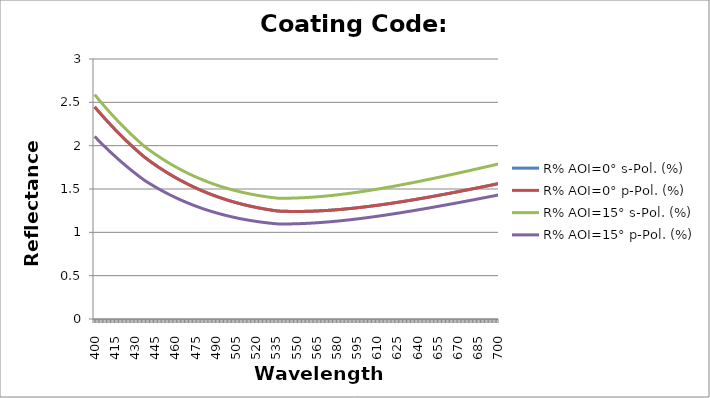
| Category | R% AOI=0° s-Pol. (%) | R% AOI=0° p-Pol. (%) | R% AOI=15° s-Pol. (%) | R% AOI=15° p-Pol. (%) |
|---|---|---|---|---|
| 400.0 | 2.447 | 2.447 | 2.589 | 2.106 |
| 401.0 | 2.429 | 2.429 | 2.57 | 2.09 |
| 402.0 | 2.411 | 2.411 | 2.551 | 2.074 |
| 403.0 | 2.393 | 2.393 | 2.532 | 2.058 |
| 404.0 | 2.375 | 2.375 | 2.514 | 2.043 |
| 405.0 | 2.358 | 2.358 | 2.496 | 2.027 |
| 406.0 | 2.34 | 2.34 | 2.478 | 2.012 |
| 407.0 | 2.323 | 2.323 | 2.46 | 1.996 |
| 408.0 | 2.306 | 2.306 | 2.442 | 1.981 |
| 409.0 | 2.289 | 2.289 | 2.424 | 1.966 |
| 410.0 | 2.272 | 2.272 | 2.407 | 1.952 |
| 411.0 | 2.255 | 2.255 | 2.389 | 1.937 |
| 412.0 | 2.238 | 2.238 | 2.372 | 1.922 |
| 413.0 | 2.222 | 2.222 | 2.355 | 1.908 |
| 414.0 | 2.206 | 2.206 | 2.338 | 1.893 |
| 415.0 | 2.189 | 2.189 | 2.321 | 1.879 |
| 416.0 | 2.173 | 2.173 | 2.305 | 1.865 |
| 417.0 | 2.157 | 2.157 | 2.288 | 1.851 |
| 418.0 | 2.142 | 2.142 | 2.272 | 1.838 |
| 419.0 | 2.126 | 2.126 | 2.256 | 1.824 |
| 420.0 | 2.11 | 2.11 | 2.24 | 1.81 |
| 421.0 | 2.095 | 2.095 | 2.224 | 1.797 |
| 422.0 | 2.08 | 2.08 | 2.208 | 1.784 |
| 423.0 | 2.065 | 2.065 | 2.193 | 1.77 |
| 424.0 | 2.05 | 2.05 | 2.178 | 1.758 |
| 425.0 | 2.035 | 2.035 | 2.162 | 1.745 |
| 426.0 | 2.02 | 2.02 | 2.147 | 1.732 |
| 427.0 | 2.006 | 2.006 | 2.132 | 1.719 |
| 428.0 | 1.991 | 1.991 | 2.118 | 1.707 |
| 429.0 | 1.977 | 1.977 | 2.103 | 1.695 |
| 430.0 | 1.963 | 1.963 | 2.089 | 1.682 |
| 431.0 | 1.949 | 1.949 | 2.074 | 1.67 |
| 432.0 | 1.935 | 1.935 | 2.06 | 1.658 |
| 433.0 | 1.921 | 1.921 | 2.046 | 1.646 |
| 434.0 | 1.908 | 1.908 | 2.033 | 1.635 |
| 435.0 | 1.894 | 1.894 | 2.019 | 1.623 |
| 436.0 | 1.881 | 1.881 | 2.005 | 1.612 |
| 437.0 | 1.868 | 1.868 | 1.992 | 1.6 |
| 438.0 | 1.856 | 1.856 | 1.98 | 1.59 |
| 439.0 | 1.845 | 1.845 | 1.968 | 1.581 |
| 440.0 | 1.833 | 1.833 | 1.957 | 1.571 |
| 441.0 | 1.822 | 1.822 | 1.946 | 1.561 |
| 442.0 | 1.811 | 1.811 | 1.934 | 1.552 |
| 443.0 | 1.8 | 1.8 | 1.924 | 1.543 |
| 444.0 | 1.789 | 1.789 | 1.913 | 1.533 |
| 445.0 | 1.778 | 1.778 | 1.902 | 1.524 |
| 446.0 | 1.768 | 1.768 | 1.891 | 1.515 |
| 447.0 | 1.757 | 1.757 | 1.881 | 1.506 |
| 448.0 | 1.747 | 1.747 | 1.87 | 1.498 |
| 449.0 | 1.736 | 1.736 | 1.86 | 1.489 |
| 450.0 | 1.726 | 1.726 | 1.85 | 1.481 |
| 451.0 | 1.716 | 1.716 | 1.84 | 1.472 |
| 452.0 | 1.707 | 1.707 | 1.83 | 1.464 |
| 453.0 | 1.697 | 1.697 | 1.821 | 1.456 |
| 454.0 | 1.687 | 1.687 | 1.811 | 1.448 |
| 455.0 | 1.678 | 1.678 | 1.802 | 1.44 |
| 456.0 | 1.668 | 1.668 | 1.793 | 1.432 |
| 457.0 | 1.659 | 1.659 | 1.784 | 1.424 |
| 458.0 | 1.65 | 1.65 | 1.774 | 1.417 |
| 459.0 | 1.641 | 1.641 | 1.766 | 1.409 |
| 460.0 | 1.632 | 1.632 | 1.757 | 1.402 |
| 461.0 | 1.623 | 1.623 | 1.748 | 1.394 |
| 462.0 | 1.615 | 1.615 | 1.74 | 1.387 |
| 463.0 | 1.606 | 1.606 | 1.731 | 1.38 |
| 464.0 | 1.598 | 1.598 | 1.723 | 1.373 |
| 465.0 | 1.59 | 1.59 | 1.715 | 1.366 |
| 466.0 | 1.581 | 1.581 | 1.707 | 1.36 |
| 467.0 | 1.573 | 1.573 | 1.699 | 1.353 |
| 468.0 | 1.565 | 1.565 | 1.691 | 1.346 |
| 469.0 | 1.558 | 1.558 | 1.684 | 1.34 |
| 470.0 | 1.55 | 1.55 | 1.676 | 1.334 |
| 471.0 | 1.542 | 1.542 | 1.669 | 1.328 |
| 472.0 | 1.535 | 1.535 | 1.662 | 1.321 |
| 473.0 | 1.527 | 1.527 | 1.654 | 1.315 |
| 474.0 | 1.52 | 1.52 | 1.647 | 1.309 |
| 475.0 | 1.513 | 1.513 | 1.64 | 1.304 |
| 476.0 | 1.506 | 1.506 | 1.633 | 1.298 |
| 477.0 | 1.499 | 1.499 | 1.627 | 1.292 |
| 478.0 | 1.492 | 1.492 | 1.62 | 1.286 |
| 479.0 | 1.485 | 1.485 | 1.614 | 1.281 |
| 480.0 | 1.479 | 1.479 | 1.607 | 1.276 |
| 481.0 | 1.472 | 1.472 | 1.601 | 1.27 |
| 482.0 | 1.466 | 1.466 | 1.595 | 1.265 |
| 483.0 | 1.459 | 1.459 | 1.589 | 1.26 |
| 484.0 | 1.453 | 1.453 | 1.583 | 1.255 |
| 485.0 | 1.447 | 1.447 | 1.577 | 1.25 |
| 486.0 | 1.441 | 1.441 | 1.571 | 1.245 |
| 487.0 | 1.435 | 1.435 | 1.565 | 1.24 |
| 488.0 | 1.429 | 1.429 | 1.56 | 1.236 |
| 489.0 | 1.423 | 1.423 | 1.554 | 1.231 |
| 490.0 | 1.418 | 1.418 | 1.549 | 1.226 |
| 491.0 | 1.412 | 1.412 | 1.544 | 1.222 |
| 492.0 | 1.406 | 1.406 | 1.538 | 1.218 |
| 493.0 | 1.401 | 1.401 | 1.533 | 1.213 |
| 494.0 | 1.396 | 1.396 | 1.528 | 1.209 |
| 495.0 | 1.39 | 1.39 | 1.523 | 1.205 |
| 496.0 | 1.385 | 1.385 | 1.519 | 1.201 |
| 497.0 | 1.38 | 1.38 | 1.514 | 1.197 |
| 498.0 | 1.376 | 1.376 | 1.509 | 1.193 |
| 499.0 | 1.371 | 1.371 | 1.505 | 1.189 |
| 500.0 | 1.366 | 1.366 | 1.5 | 1.186 |
| 501.0 | 1.361 | 1.361 | 1.496 | 1.182 |
| 502.0 | 1.357 | 1.357 | 1.492 | 1.178 |
| 503.0 | 1.352 | 1.352 | 1.488 | 1.175 |
| 504.0 | 1.348 | 1.348 | 1.484 | 1.172 |
| 505.0 | 1.343 | 1.343 | 1.48 | 1.168 |
| 506.0 | 1.339 | 1.339 | 1.476 | 1.165 |
| 507.0 | 1.335 | 1.335 | 1.472 | 1.162 |
| 508.0 | 1.331 | 1.331 | 1.468 | 1.159 |
| 509.0 | 1.327 | 1.327 | 1.464 | 1.156 |
| 510.0 | 1.323 | 1.323 | 1.461 | 1.152 |
| 511.0 | 1.319 | 1.319 | 1.457 | 1.15 |
| 512.0 | 1.315 | 1.315 | 1.454 | 1.147 |
| 513.0 | 1.312 | 1.312 | 1.45 | 1.144 |
| 514.0 | 1.308 | 1.308 | 1.447 | 1.141 |
| 515.0 | 1.304 | 1.304 | 1.444 | 1.139 |
| 516.0 | 1.301 | 1.301 | 1.441 | 1.136 |
| 517.0 | 1.297 | 1.297 | 1.438 | 1.134 |
| 518.0 | 1.294 | 1.294 | 1.435 | 1.131 |
| 519.0 | 1.291 | 1.291 | 1.432 | 1.129 |
| 520.0 | 1.288 | 1.288 | 1.429 | 1.126 |
| 521.0 | 1.285 | 1.285 | 1.427 | 1.124 |
| 522.0 | 1.282 | 1.282 | 1.424 | 1.122 |
| 523.0 | 1.279 | 1.279 | 1.422 | 1.12 |
| 524.0 | 1.276 | 1.276 | 1.419 | 1.118 |
| 525.0 | 1.273 | 1.273 | 1.416 | 1.116 |
| 526.0 | 1.27 | 1.27 | 1.414 | 1.114 |
| 527.0 | 1.267 | 1.267 | 1.412 | 1.112 |
| 528.0 | 1.265 | 1.265 | 1.41 | 1.11 |
| 529.0 | 1.262 | 1.262 | 1.408 | 1.108 |
| 530.0 | 1.26 | 1.26 | 1.405 | 1.106 |
| 531.0 | 1.257 | 1.257 | 1.403 | 1.105 |
| 532.0 | 1.255 | 1.255 | 1.401 | 1.103 |
| 533.0 | 1.253 | 1.253 | 1.4 | 1.102 |
| 534.0 | 1.25 | 1.25 | 1.398 | 1.1 |
| 535.0 | 1.248 | 1.248 | 1.396 | 1.098 |
| 536.0 | 1.246 | 1.246 | 1.394 | 1.097 |
| 537.0 | 1.245 | 1.245 | 1.394 | 1.097 |
| 538.0 | 1.244 | 1.244 | 1.394 | 1.097 |
| 539.0 | 1.244 | 1.244 | 1.394 | 1.096 |
| 540.0 | 1.243 | 1.243 | 1.394 | 1.096 |
| 541.0 | 1.243 | 1.243 | 1.394 | 1.097 |
| 542.0 | 1.242 | 1.242 | 1.394 | 1.097 |
| 543.0 | 1.242 | 1.242 | 1.394 | 1.097 |
| 544.0 | 1.242 | 1.242 | 1.394 | 1.097 |
| 545.0 | 1.242 | 1.242 | 1.394 | 1.097 |
| 546.0 | 1.241 | 1.241 | 1.395 | 1.097 |
| 547.0 | 1.241 | 1.241 | 1.395 | 1.098 |
| 548.0 | 1.241 | 1.241 | 1.395 | 1.098 |
| 549.0 | 1.241 | 1.241 | 1.396 | 1.098 |
| 550.0 | 1.241 | 1.241 | 1.396 | 1.099 |
| 551.0 | 1.241 | 1.241 | 1.397 | 1.099 |
| 552.0 | 1.241 | 1.241 | 1.398 | 1.1 |
| 553.0 | 1.241 | 1.241 | 1.398 | 1.1 |
| 554.0 | 1.241 | 1.241 | 1.399 | 1.101 |
| 555.0 | 1.242 | 1.242 | 1.4 | 1.102 |
| 556.0 | 1.242 | 1.242 | 1.4 | 1.102 |
| 557.0 | 1.242 | 1.242 | 1.401 | 1.103 |
| 558.0 | 1.242 | 1.242 | 1.402 | 1.104 |
| 559.0 | 1.243 | 1.243 | 1.403 | 1.105 |
| 560.0 | 1.243 | 1.243 | 1.404 | 1.105 |
| 561.0 | 1.244 | 1.244 | 1.405 | 1.106 |
| 562.0 | 1.244 | 1.244 | 1.406 | 1.107 |
| 563.0 | 1.245 | 1.245 | 1.407 | 1.108 |
| 564.0 | 1.246 | 1.246 | 1.408 | 1.109 |
| 565.0 | 1.246 | 1.246 | 1.41 | 1.11 |
| 566.0 | 1.247 | 1.247 | 1.411 | 1.111 |
| 567.0 | 1.248 | 1.248 | 1.412 | 1.112 |
| 568.0 | 1.248 | 1.248 | 1.413 | 1.113 |
| 569.0 | 1.249 | 1.249 | 1.415 | 1.114 |
| 570.0 | 1.25 | 1.25 | 1.416 | 1.116 |
| 571.0 | 1.251 | 1.251 | 1.418 | 1.117 |
| 572.0 | 1.252 | 1.252 | 1.419 | 1.118 |
| 573.0 | 1.253 | 1.253 | 1.42 | 1.119 |
| 574.0 | 1.254 | 1.254 | 1.422 | 1.121 |
| 575.0 | 1.255 | 1.255 | 1.424 | 1.122 |
| 576.0 | 1.256 | 1.256 | 1.425 | 1.123 |
| 577.0 | 1.257 | 1.257 | 1.427 | 1.125 |
| 578.0 | 1.258 | 1.258 | 1.429 | 1.126 |
| 579.0 | 1.26 | 1.26 | 1.43 | 1.128 |
| 580.0 | 1.261 | 1.261 | 1.432 | 1.129 |
| 581.0 | 1.262 | 1.262 | 1.434 | 1.131 |
| 582.0 | 1.263 | 1.263 | 1.436 | 1.132 |
| 583.0 | 1.265 | 1.265 | 1.438 | 1.134 |
| 584.0 | 1.266 | 1.266 | 1.439 | 1.135 |
| 585.0 | 1.268 | 1.268 | 1.441 | 1.137 |
| 586.0 | 1.269 | 1.269 | 1.443 | 1.139 |
| 587.0 | 1.27 | 1.27 | 1.445 | 1.14 |
| 588.0 | 1.272 | 1.272 | 1.447 | 1.142 |
| 589.0 | 1.273 | 1.273 | 1.449 | 1.144 |
| 590.0 | 1.275 | 1.275 | 1.451 | 1.146 |
| 591.0 | 1.277 | 1.277 | 1.453 | 1.147 |
| 592.0 | 1.278 | 1.278 | 1.456 | 1.149 |
| 593.0 | 1.28 | 1.28 | 1.458 | 1.151 |
| 594.0 | 1.282 | 1.282 | 1.46 | 1.153 |
| 595.0 | 1.283 | 1.283 | 1.462 | 1.155 |
| 596.0 | 1.285 | 1.285 | 1.464 | 1.157 |
| 597.0 | 1.287 | 1.287 | 1.467 | 1.158 |
| 598.0 | 1.288 | 1.288 | 1.469 | 1.16 |
| 599.0 | 1.29 | 1.29 | 1.471 | 1.162 |
| 600.0 | 1.292 | 1.292 | 1.474 | 1.164 |
| 601.0 | 1.294 | 1.294 | 1.476 | 1.166 |
| 602.0 | 1.296 | 1.296 | 1.478 | 1.168 |
| 603.0 | 1.298 | 1.298 | 1.481 | 1.17 |
| 604.0 | 1.3 | 1.3 | 1.483 | 1.172 |
| 605.0 | 1.302 | 1.302 | 1.486 | 1.175 |
| 606.0 | 1.304 | 1.304 | 1.488 | 1.177 |
| 607.0 | 1.306 | 1.306 | 1.491 | 1.179 |
| 608.0 | 1.308 | 1.308 | 1.493 | 1.181 |
| 609.0 | 1.31 | 1.31 | 1.496 | 1.183 |
| 610.0 | 1.312 | 1.312 | 1.498 | 1.185 |
| 611.0 | 1.314 | 1.314 | 1.501 | 1.188 |
| 612.0 | 1.316 | 1.316 | 1.504 | 1.19 |
| 613.0 | 1.318 | 1.318 | 1.506 | 1.192 |
| 614.0 | 1.32 | 1.32 | 1.509 | 1.194 |
| 615.0 | 1.323 | 1.323 | 1.512 | 1.197 |
| 616.0 | 1.325 | 1.325 | 1.514 | 1.199 |
| 617.0 | 1.327 | 1.327 | 1.517 | 1.201 |
| 618.0 | 1.329 | 1.329 | 1.52 | 1.204 |
| 619.0 | 1.332 | 1.332 | 1.522 | 1.206 |
| 620.0 | 1.334 | 1.334 | 1.525 | 1.208 |
| 621.0 | 1.336 | 1.336 | 1.528 | 1.211 |
| 622.0 | 1.339 | 1.339 | 1.531 | 1.213 |
| 623.0 | 1.341 | 1.341 | 1.534 | 1.215 |
| 624.0 | 1.343 | 1.343 | 1.537 | 1.218 |
| 625.0 | 1.346 | 1.346 | 1.54 | 1.22 |
| 626.0 | 1.348 | 1.348 | 1.542 | 1.223 |
| 627.0 | 1.351 | 1.351 | 1.545 | 1.225 |
| 628.0 | 1.353 | 1.353 | 1.548 | 1.228 |
| 629.0 | 1.356 | 1.356 | 1.551 | 1.23 |
| 630.0 | 1.358 | 1.358 | 1.554 | 1.233 |
| 631.0 | 1.36 | 1.36 | 1.557 | 1.235 |
| 632.0 | 1.363 | 1.363 | 1.56 | 1.238 |
| 633.0 | 1.366 | 1.366 | 1.563 | 1.24 |
| 634.0 | 1.368 | 1.368 | 1.566 | 1.243 |
| 635.0 | 1.371 | 1.371 | 1.569 | 1.245 |
| 636.0 | 1.373 | 1.373 | 1.572 | 1.248 |
| 637.0 | 1.376 | 1.376 | 1.575 | 1.25 |
| 638.0 | 1.378 | 1.378 | 1.578 | 1.253 |
| 639.0 | 1.381 | 1.381 | 1.582 | 1.256 |
| 640.0 | 1.384 | 1.384 | 1.585 | 1.258 |
| 641.0 | 1.386 | 1.386 | 1.588 | 1.261 |
| 642.0 | 1.389 | 1.389 | 1.591 | 1.264 |
| 643.0 | 1.392 | 1.392 | 1.594 | 1.266 |
| 644.0 | 1.394 | 1.394 | 1.597 | 1.269 |
| 645.0 | 1.397 | 1.397 | 1.6 | 1.272 |
| 646.0 | 1.4 | 1.4 | 1.604 | 1.274 |
| 647.0 | 1.403 | 1.403 | 1.607 | 1.277 |
| 648.0 | 1.406 | 1.406 | 1.61 | 1.28 |
| 649.0 | 1.408 | 1.408 | 1.613 | 1.283 |
| 650.0 | 1.411 | 1.411 | 1.616 | 1.285 |
| 651.0 | 1.414 | 1.414 | 1.62 | 1.288 |
| 652.0 | 1.417 | 1.417 | 1.623 | 1.291 |
| 653.0 | 1.419 | 1.419 | 1.626 | 1.294 |
| 654.0 | 1.422 | 1.422 | 1.629 | 1.296 |
| 655.0 | 1.425 | 1.425 | 1.633 | 1.299 |
| 656.0 | 1.428 | 1.428 | 1.636 | 1.302 |
| 657.0 | 1.431 | 1.431 | 1.639 | 1.305 |
| 658.0 | 1.434 | 1.434 | 1.643 | 1.308 |
| 659.0 | 1.437 | 1.437 | 1.646 | 1.31 |
| 660.0 | 1.44 | 1.44 | 1.649 | 1.313 |
| 661.0 | 1.442 | 1.442 | 1.653 | 1.316 |
| 662.0 | 1.445 | 1.445 | 1.656 | 1.319 |
| 663.0 | 1.448 | 1.448 | 1.659 | 1.322 |
| 664.0 | 1.451 | 1.451 | 1.663 | 1.324 |
| 665.0 | 1.454 | 1.454 | 1.666 | 1.327 |
| 666.0 | 1.457 | 1.457 | 1.669 | 1.33 |
| 667.0 | 1.46 | 1.46 | 1.673 | 1.333 |
| 668.0 | 1.463 | 1.463 | 1.676 | 1.336 |
| 669.0 | 1.466 | 1.466 | 1.68 | 1.339 |
| 670.0 | 1.469 | 1.469 | 1.683 | 1.342 |
| 671.0 | 1.472 | 1.472 | 1.686 | 1.345 |
| 672.0 | 1.475 | 1.475 | 1.69 | 1.348 |
| 673.0 | 1.478 | 1.478 | 1.693 | 1.35 |
| 674.0 | 1.481 | 1.481 | 1.697 | 1.353 |
| 675.0 | 1.484 | 1.484 | 1.7 | 1.356 |
| 676.0 | 1.487 | 1.487 | 1.704 | 1.359 |
| 677.0 | 1.49 | 1.49 | 1.707 | 1.362 |
| 678.0 | 1.493 | 1.493 | 1.711 | 1.365 |
| 679.0 | 1.496 | 1.496 | 1.714 | 1.368 |
| 680.0 | 1.499 | 1.499 | 1.718 | 1.371 |
| 681.0 | 1.502 | 1.502 | 1.721 | 1.374 |
| 682.0 | 1.505 | 1.505 | 1.724 | 1.377 |
| 683.0 | 1.508 | 1.508 | 1.728 | 1.38 |
| 684.0 | 1.512 | 1.512 | 1.732 | 1.383 |
| 685.0 | 1.515 | 1.515 | 1.735 | 1.386 |
| 686.0 | 1.518 | 1.518 | 1.739 | 1.389 |
| 687.0 | 1.521 | 1.521 | 1.742 | 1.392 |
| 688.0 | 1.524 | 1.524 | 1.746 | 1.395 |
| 689.0 | 1.527 | 1.527 | 1.749 | 1.398 |
| 690.0 | 1.53 | 1.53 | 1.753 | 1.401 |
| 691.0 | 1.533 | 1.533 | 1.756 | 1.404 |
| 692.0 | 1.537 | 1.537 | 1.76 | 1.407 |
| 693.0 | 1.54 | 1.54 | 1.763 | 1.41 |
| 694.0 | 1.543 | 1.543 | 1.767 | 1.413 |
| 695.0 | 1.546 | 1.546 | 1.77 | 1.416 |
| 696.0 | 1.549 | 1.549 | 1.774 | 1.419 |
| 697.0 | 1.552 | 1.552 | 1.778 | 1.422 |
| 698.0 | 1.556 | 1.556 | 1.781 | 1.425 |
| 699.0 | 1.559 | 1.559 | 1.785 | 1.428 |
| 700.0 | 1.562 | 1.562 | 1.788 | 1.431 |